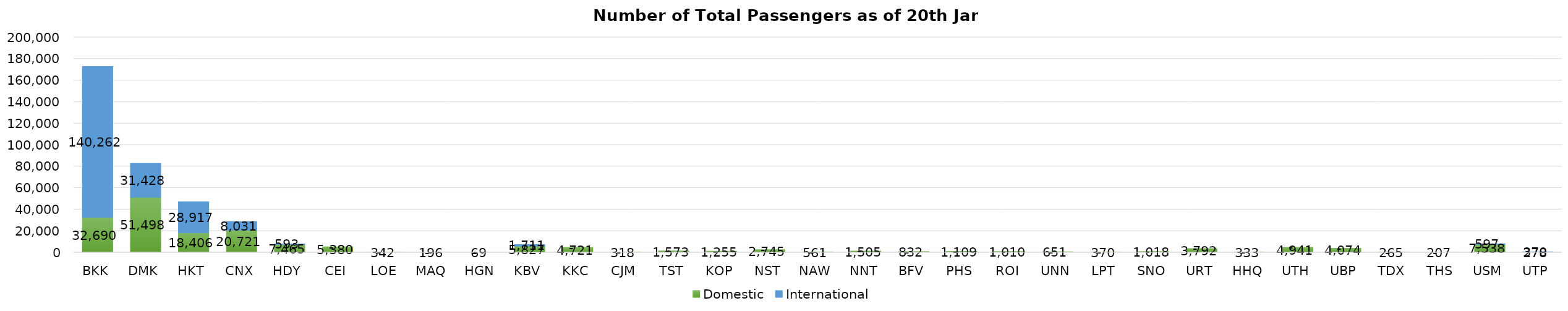
| Category | Domestic | International |
|---|---|---|
| BKK | 32690 | 140262 |
| DMK | 51498 | 31428 |
| HKT | 18406 | 28917 |
| CNX | 20721 | 8031 |
| HDY | 7465 | 593 |
| CEI | 5380 | 0 |
| LOE | 342 | 0 |
| MAQ | 196 | 0 |
| HGN | 69 | 0 |
| KBV | 5827 | 1711 |
| KKC | 4721 | 0 |
| CJM | 318 | 0 |
| TST | 1573 | 0 |
| KOP | 1255 | 0 |
| NST | 2745 | 0 |
| NAW | 561 | 0 |
| NNT | 1505 | 0 |
| BFV | 832 | 0 |
| PHS | 1109 | 0 |
| ROI | 1010 | 0 |
| UNN | 651 | 0 |
| LPT | 370 | 0 |
| SNO | 1018 | 0 |
| URT | 3792 | 0 |
| HHQ | 333 | 0 |
| UTH | 4941 | 0 |
| UBP | 4074 | 0 |
| TDX | 265 | 0 |
| THS | 207 | 0 |
| USM | 7538 | 597 |
| UTP | 278 | 370 |